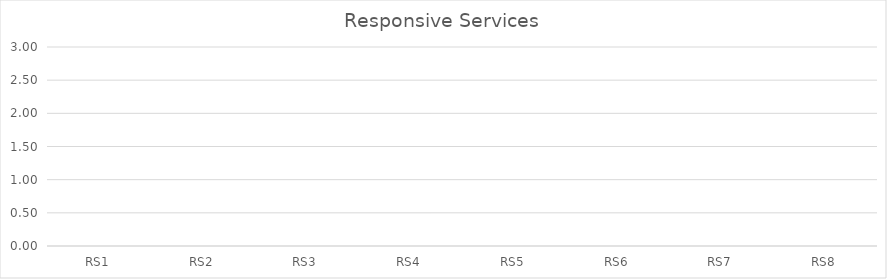
| Category | Series 0 |
|---|---|
| RS1 | 0 |
| RS2 | 0 |
| RS3 | 0 |
| RS4 | 0 |
| RS5 | 0 |
| RS6 | 0 |
| RS7 | 0 |
| RS8 | 0 |